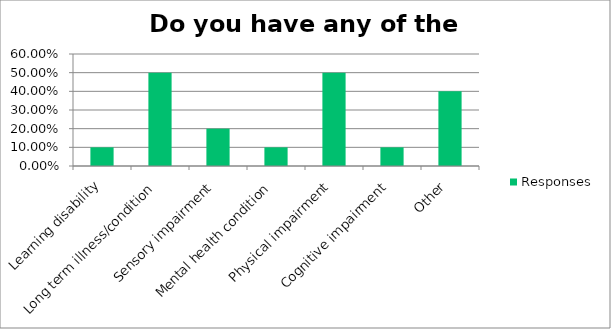
| Category | Responses |
|---|---|
| Learning disability | 0.1 |
| Long term illness/condition | 0.5 |
| Sensory impairment | 0.2 |
| Mental health condition | 0.1 |
| Physical impairment | 0.5 |
| Cognitive impairment | 0.1 |
| Other | 0.4 |